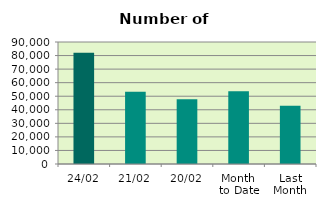
| Category | Series 0 |
|---|---|
| 24/02 | 82086 |
| 21/02 | 53348 |
| 20/02 | 47694 |
| Month 
to Date | 53706.875 |
| Last
Month | 43047.455 |